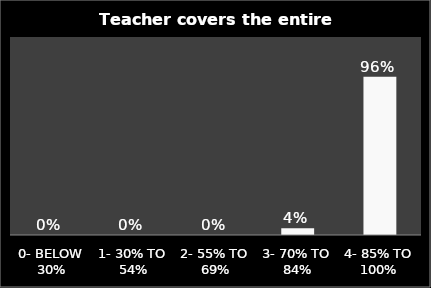
| Category | Series 0 |
|---|---|
| 0- BELOW 30% | 0 |
| 1- 30% TO 54% | 0 |
| 2- 55% TO 69% | 0 |
| 3- 70% TO 84% | 0.04 |
| 4- 85% TO 100% | 0.96 |